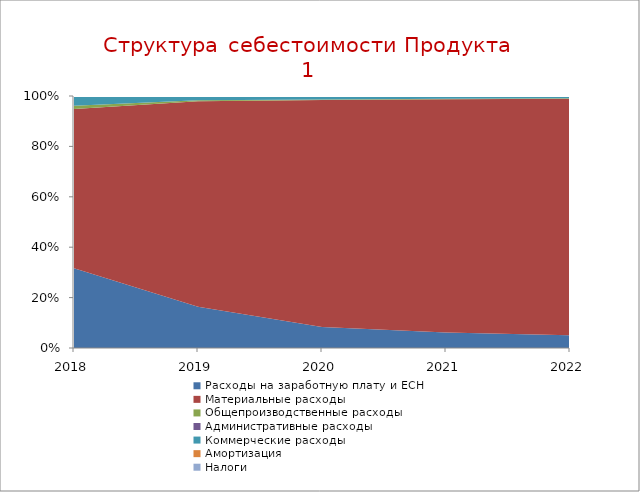
| Category | Расходы на заработную плату и ЕСН | Материальные расходы | Общепроизводственные расходы | Административные расходы | Коммерческие расходы | Амортизация | Налоги |
|---|---|---|---|---|---|---|---|
| 2018.0 | 0.317 | 0.632 | 0.013 | 0 | 0.038 | 0 | 0 |
| 2019.0 | 0.163 | 0.816 | 0.004 | 0 | 0.016 | 0 | 0 |
| 2020.0 | 0.083 | 0.901 | 0.002 | 0 | 0.014 | 0 | 0 |
| 2021.0 | 0.062 | 0.925 | 0.002 | 0 | 0.011 | 0 | 0 |
| 2022.0 | 0.051 | 0.939 | 0.001 | 0 | 0.009 | 0 | 0 |